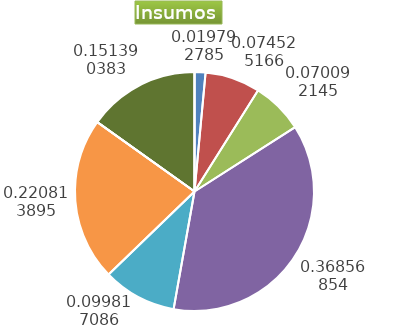
| Category | Series 0 |
|---|---|
| Control arvenses | 3074310 |
| Control fitosanitario | 15488190 |
| Cosecha y beneficio | 14566897.593 |
| Fertilización | 76597744 |
| Instalación | 20744482.436 |
| Otros | 45890640 |
| Podas | 0 |
| Riego | 0 |
| Transporte | 31462701 |
| Tutorado | 0 |